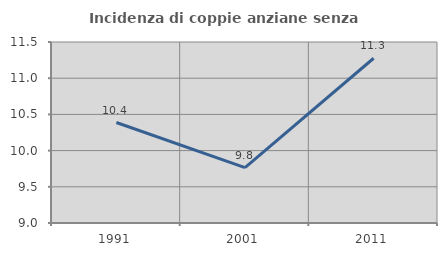
| Category | Incidenza di coppie anziane senza figli  |
|---|---|
| 1991.0 | 10.388 |
| 2001.0 | 9.764 |
| 2011.0 | 11.276 |